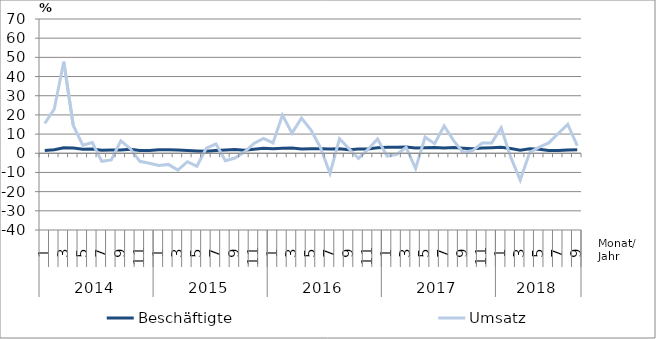
| Category | Beschäftigte | Umsatz |
|---|---|---|
| 0 | 1.4 | 15.5 |
| 1 | 1.8 | 23.1 |
| 2 | 2.9 | 47.7 |
| 3 | 2.7 | 14.5 |
| 4 | 2.1 | 4.2 |
| 5 | 2.2 | 5.6 |
| 6 | 1.6 | -4.2 |
| 7 | 1.7 | -3.5 |
| 8 | 1.7 | 6.5 |
| 9 | 2.1 | 2.4 |
| 10 | 1.4 | -4.2 |
| 11 | 1.4 | -5.2 |
| 12 | 1.8 | -6.4 |
| 13 | 1.8 | -5.8 |
| 14 | 1.7 | -8.8 |
| 15 | 1.5 | -4.4 |
| 16 | 1.2 | -6.8 |
| 17 | 1 | 2.7 |
| 18 | 1.4 | 4.9 |
| 19 | 1.7 | -3.9 |
| 20 | 2 | -2.5 |
| 21 | 1.6 | 0.6 |
| 22 | 2.1 | 5.1 |
| 23 | 2.6 | 7.7 |
| 24 | 2.4 | 5.4 |
| 25 | 2.6 | 19.9 |
| 26 | 2.7 | 10.5 |
| 27 | 2.2 | 18.4 |
| 28 | 2.3 | 12.1 |
| 29 | 2.3 | 2.9 |
| 30 | 2.2 | -10.5 |
| 31 | 2.4 | 7.6 |
| 32 | 1.8 | 2.4 |
| 33 | 2.2 | -2.7 |
| 34 | 2.2 | 2.1 |
| 35 | 2.9 | 7.4 |
| 36 | 3.2 | -1.5 |
| 37 | 3.2 | -0.7 |
| 38 | 3.3 | 3.1 |
| 39 | 2.7 | -7.9 |
| 40 | 2.9 | 8.4 |
| 41 | 3 | 5 |
| 42 | 2.8 | 14.2 |
| 43 | 3 | 6.6 |
| 44 | 2.6 | 0.4 |
| 45 | 2.3 | 1.4 |
| 46 | 2.7 | 5.3 |
| 47 | 2.9 | 5.4 |
| 48 | 3.1 | 13.3 |
| 49 | 2.5 | -2 |
| 50 | 1.6 | -13.9 |
| 51 | 2.4 | 0.4 |
| 52 | 2.1 | 3.2 |
| 53 | 1.5 | 5.4 |
| 54 | 1.5 | 10.3 |
| 55 | 1.7 | 15.1 |
| 56 | 1.9 | 4 |